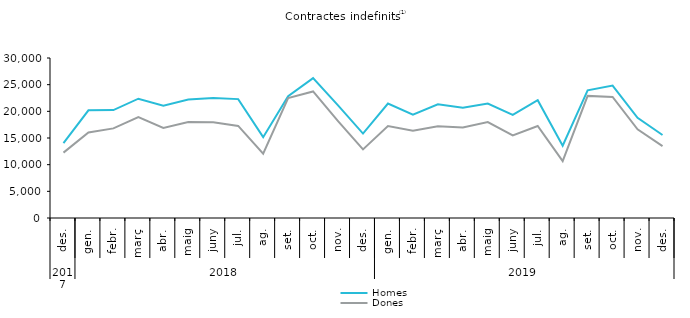
| Category | Homes | Dones |
|---|---|---|
| 0 | 14042 | 12259 |
| 1 | 20181 | 16050 |
| 2 | 20227 | 16800 |
| 3 | 22366 | 18928 |
| 4 | 21038 | 16882 |
| 5 | 22201 | 17982 |
| 6 | 22516 | 17963 |
| 7 | 22289 | 17268 |
| 8 | 15155 | 12048 |
| 9 | 22850 | 22490 |
| 10 | 26227 | 23723 |
| 11 | 21111 | 18181 |
| 12 | 15831 | 12870 |
| 13 | 21454 | 17239 |
| 14 | 19384 | 16353 |
| 15 | 21337 | 17212 |
| 16 | 20655 | 16959 |
| 17 | 21452 | 17981 |
| 18 | 19350 | 15496 |
| 19 | 22082 | 17257 |
| 20 | 13546 | 10659 |
| 21 | 23927 | 22895 |
| 22 | 24832 | 22686 |
| 23 | 18792 | 16616 |
| 24 | 15564 | 13470 |